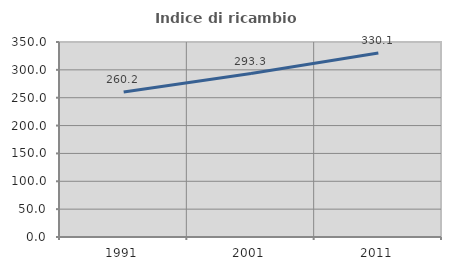
| Category | Indice di ricambio occupazionale  |
|---|---|
| 1991.0 | 260.227 |
| 2001.0 | 293.333 |
| 2011.0 | 330.07 |